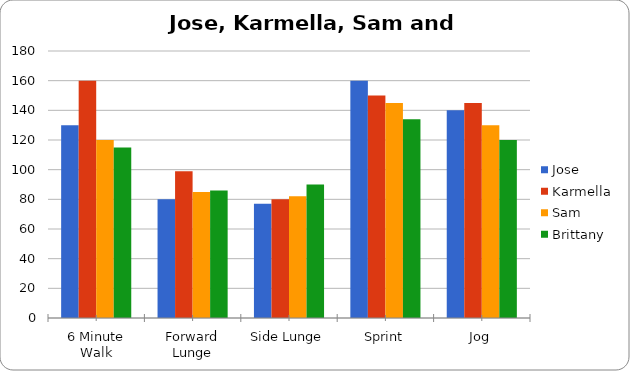
| Category | Jose | Karmella | Sam | Brittany |
|---|---|---|---|---|
| 6 Minute Walk | 130 | 160 | 120 | 115 |
| Forward Lunge | 80 | 99 | 85 | 86 |
| Side Lunge | 77 | 80 | 82 | 90 |
| Sprint | 160 | 150 | 145 | 134 |
| Jog | 140 | 145 | 130 | 120 |